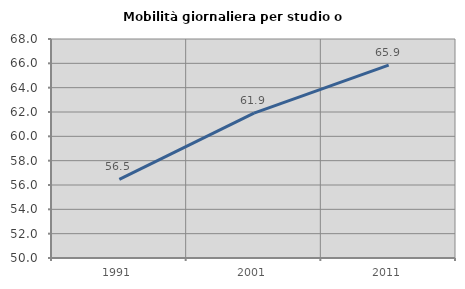
| Category | Mobilità giornaliera per studio o lavoro |
|---|---|
| 1991.0 | 56.466 |
| 2001.0 | 61.9 |
| 2011.0 | 65.859 |